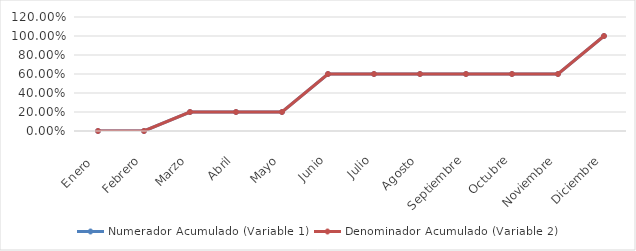
| Category | Numerador Acumulado (Variable 1) | Denominador Acumulado (Variable 2) |
|---|---|---|
| Enero  | 0 | 0 |
| Febrero | 0 | 0 |
| Marzo | 0.2 | 0.2 |
| Abril | 0.2 | 0.2 |
| Mayo | 0.2 | 0.2 |
| Junio | 0.6 | 0.6 |
| Julio | 0.6 | 0.6 |
| Agosto | 0.6 | 0.6 |
| Septiembre | 0.6 | 0.6 |
| Octubre | 0.6 | 0.6 |
| Noviembre | 0.6 | 0.6 |
| Diciembre | 1 | 1 |